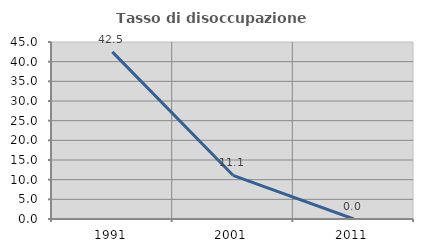
| Category | Tasso di disoccupazione giovanile  |
|---|---|
| 1991.0 | 42.5 |
| 2001.0 | 11.111 |
| 2011.0 | 0 |